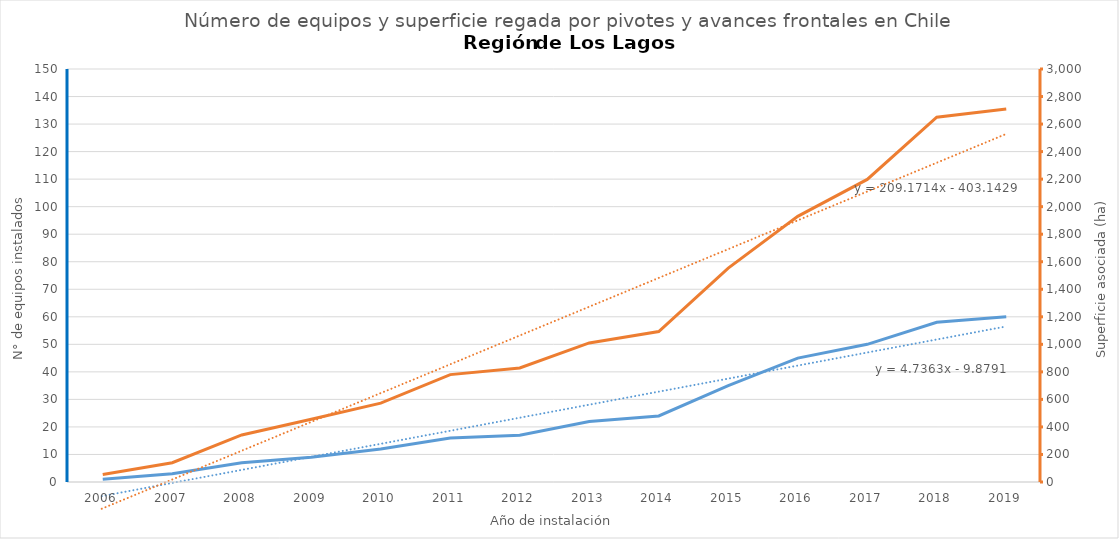
| Category | N° |
|---|---|
| 2006.0 | 1 |
| 2007.0 | 3 |
| 2008.0 | 7 |
| 2009.0 | 9 |
| 2010.0 | 12 |
| 2011.0 | 16 |
| 2012.0 | 17 |
| 2013.0 | 22 |
| 2014.0 | 24 |
| 2015.0 | 35 |
| 2016.0 | 45 |
| 2017.0 | 50 |
| 2018.0 | 58 |
| 2019.0 | 60 |